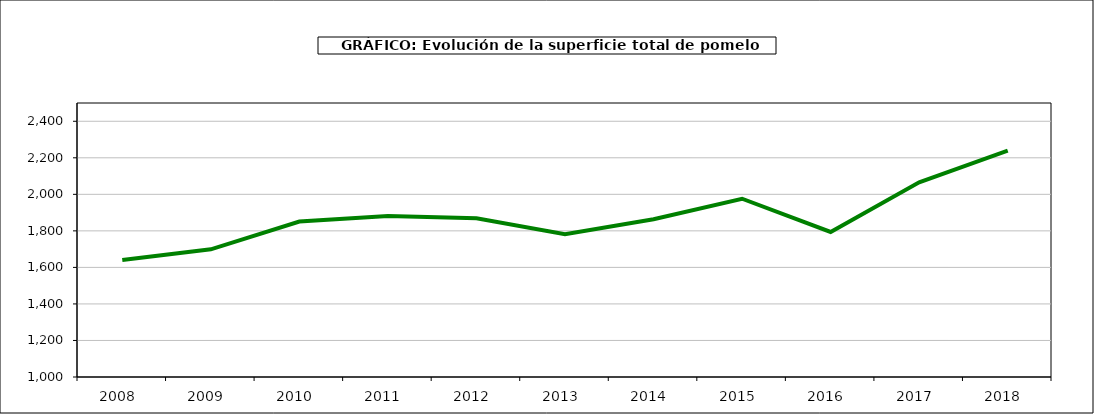
| Category | superficie |
|---|---|
| 2008.0 | 1640 |
| 2009.0 | 1699 |
| 2010.0 | 1851 |
| 2011.0 | 1882 |
| 2012.0 | 1869 |
| 2013.0 | 1781 |
| 2014.0 | 1864 |
| 2015.0 | 1976 |
| 2016.0 | 1794 |
| 2017.0 | 2066 |
| 2018.0 | 2239 |